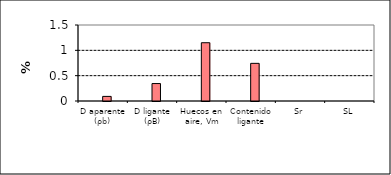
| Category | Series 1 | Series 0 | Series 5 | Series 6 |
|---|---|---|---|---|
| D aparente (ρb) |  |  | 0.091 |  |
| D ligante (ρB) |  |  | 0.344 |  |
| Huecos en aire, Vm |  |  | 1.15 |  |
| Contenido ligante |  |  | 0.743 |  |
| Sr |  |  | 0 |  |
| SL |  |  | 0 |  |